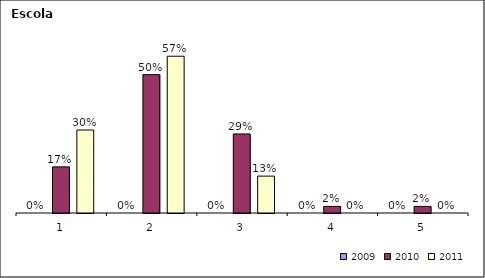
| Category | 2009 | 2010 | 2011 |
|---|---|---|---|
| 1.0 | 0 | 0.167 | 0.3 |
| 2.0 | 0 | 0.5 | 0.567 |
| 3.0 | 0 | 0.286 | 0.133 |
| 4.0 | 0 | 0.024 | 0 |
| 5.0 | 0 | 0.024 | 0 |